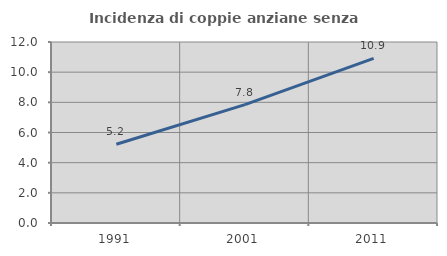
| Category | Incidenza di coppie anziane senza figli  |
|---|---|
| 1991.0 | 5.219 |
| 2001.0 | 7.846 |
| 2011.0 | 10.913 |